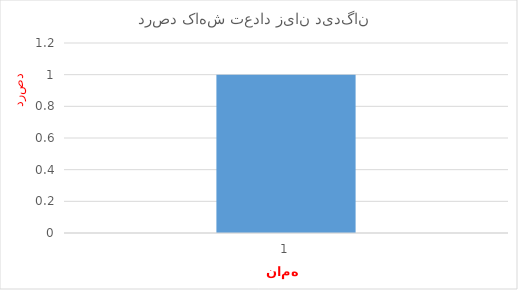
| Category | درصد کاهش  |
|---|---|
| 0 | 1 |